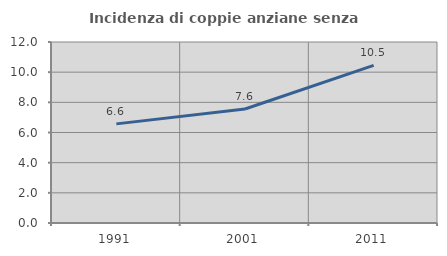
| Category | Incidenza di coppie anziane senza figli  |
|---|---|
| 1991.0 | 6.572 |
| 2001.0 | 7.557 |
| 2011.0 | 10.455 |